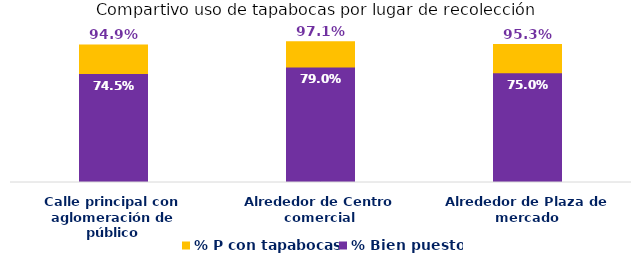
| Category | % P con tapabocas | % Bien puesto |
|---|---|---|
| Calle principal con aglomeración de público | 0.949 | 0.745 |
| Alrededor de Centro comercial | 0.971 | 0.79 |
| Alrededor de Plaza de mercado | 0.953 | 0.75 |